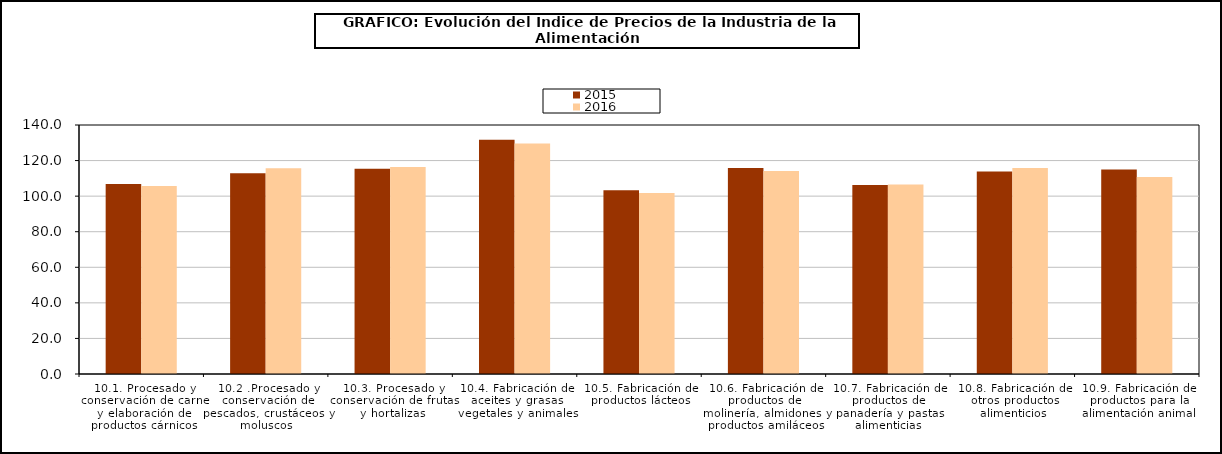
| Category | 2015 | 2016 |
|---|---|---|
| 10.1. Procesado y conservación de carne y elaboración de productos cárnicos | 106.868 | 105.755 |
| 10.2 .Procesado y conservación de pescados, crustáceos y moluscos | 112.821 | 115.711 |
| 10.3. Procesado y conservación de frutas y hortalizas | 115.346 | 116.35 |
| 10.4. Fabricación de aceites y grasas vegetales y animales | 131.774 | 129.605 |
| 10.5. Fabricación de productos lácteos | 103.372 | 101.789 |
| 10.6. Fabricación de productos de molinería, almidones y productos amiláceos | 115.852 | 114.084 |
| 10.7. Fabricación de productos de panadería y pastas alimenticias | 106.31 | 106.541 |
| 10.8. Fabricación de otros productos alimenticios | 113.854 | 115.82 |
| 10.9. Fabricación de productos para la alimentación animal | 115.042 | 110.774 |